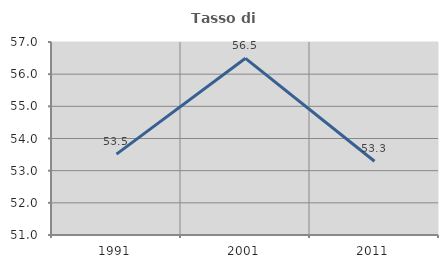
| Category | Tasso di occupazione   |
|---|---|
| 1991.0 | 53.514 |
| 2001.0 | 56.493 |
| 2011.0 | 53.293 |